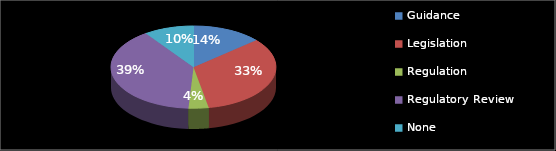
| Category | Series 0 |
|---|---|
| Guidance | 7 |
| Legislation | 17 |
| Regulation | 2 |
| Regulatory Review | 20 |
| None | 5 |